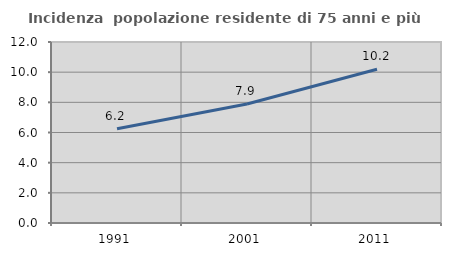
| Category | Incidenza  popolazione residente di 75 anni e più |
|---|---|
| 1991.0 | 6.248 |
| 2001.0 | 7.894 |
| 2011.0 | 10.196 |